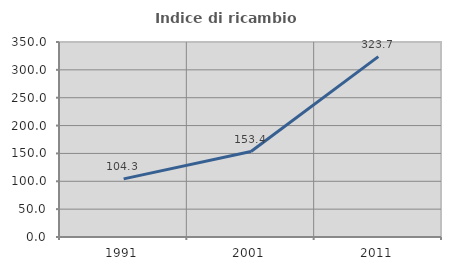
| Category | Indice di ricambio occupazionale  |
|---|---|
| 1991.0 | 104.338 |
| 2001.0 | 153.389 |
| 2011.0 | 323.742 |